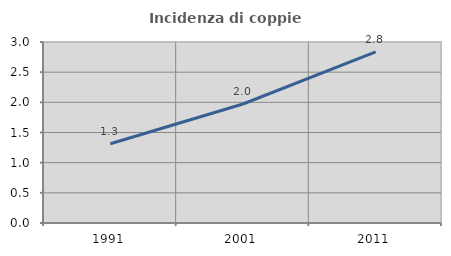
| Category | Incidenza di coppie miste |
|---|---|
| 1991.0 | 1.314 |
| 2001.0 | 1.973 |
| 2011.0 | 2.836 |